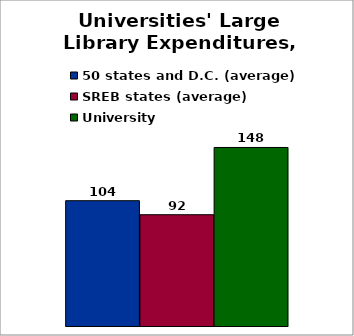
| Category | 50 states and D.C. (average) | SREB states (average) | University |
|---|---|---|---|
| 0 | 103.879 | 92.267 | 148 |